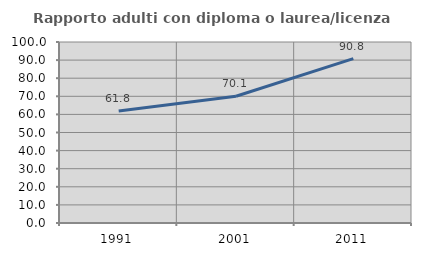
| Category | Rapporto adulti con diploma o laurea/licenza media  |
|---|---|
| 1991.0 | 61.835 |
| 2001.0 | 70.055 |
| 2011.0 | 90.787 |